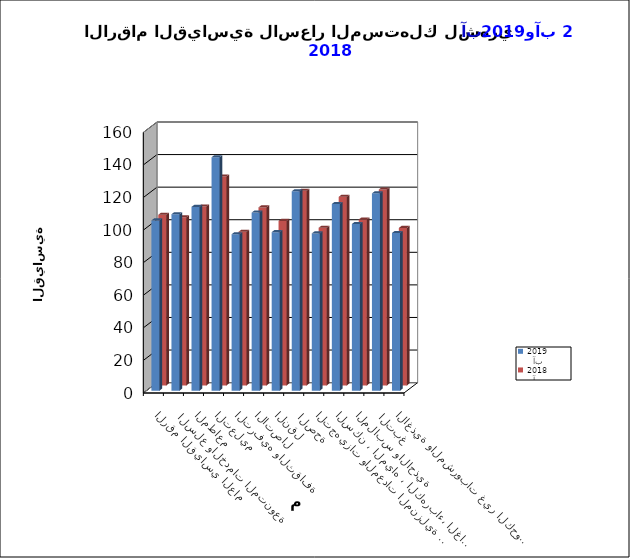
| Category |   آب     2019      |   آب     2018 |
|---|---|---|
| الاغذية والمشروبات غير الكحولية | 96.8 | 96.7 |
|  التبغ | 121.1 | 120.3 |
| الملابس والاحذية | 102.3 | 101.9 |
| السكن ، المياه ، الكهرباء، الغاز  | 114.6 | 115.8 |
| التجهيزات والمعدات المنزلية والصيانة | 96.5 | 96.8 |
|  الصحة | 122.4 | 119.5 |
| النقل | 97.3 | 101 |
| الاتصال | 109.3 | 109.3 |
| الترفيه والثقافة | 96 | 94.3 |
| التعليم | 143.3 | 128.3 |
| المطاعم  | 112.8 | 109.8 |
|  السلع والخدمات المتنوعة | 108.3 | 103.2 |
| الرقم القياسي العام | 104.5 | 104.8 |